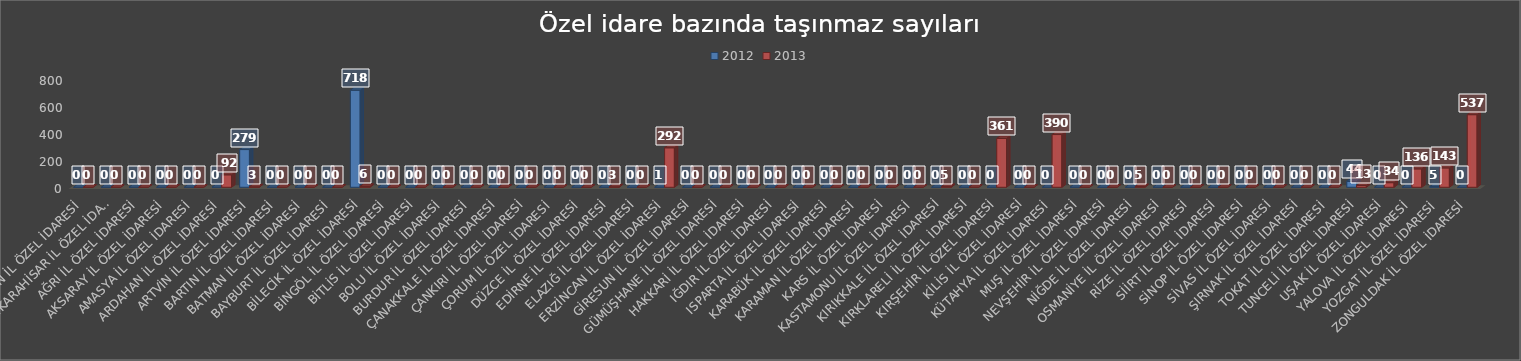
| Category | 2012 | 2013 |
|---|---|---|
| ADIYAMAN İL ÖZEL İDARESİ | 0 | 0 |
| AFYONKARAHİSAR İL ÖZEL İDARESİ | 0 | 0 |
| AĞRI İL ÖZEL İDARESİ | 0 | 0 |
| AKSARAY İL ÖZEL İDARESİ | 0 | 0 |
| AMASYA İL ÖZEL İDARESİ | 0 | 0 |
| ARDAHAN İL ÖZEL İDARESİ | 0 | 92 |
| ARTVİN İL ÖZEL İDARESİ | 279 | 3 |
| BARTIN İL ÖZEL İDARESİ | 0 | 0 |
| BATMAN İL ÖZEL İDARESİ | 0 | 0 |
| BAYBURT İL ÖZEL İDARESİ | 0 | 0 |
| BİLECİK İL ÖZEL İDARESİ | 718 | 6 |
| BİNGÖL İL ÖZEL İDARESİ | 0 | 0 |
| BİTLİS İL ÖZEL İDARESİ | 0 | 0 |
| BOLU İL ÖZEL İDARESİ | 0 | 0 |
| BURDUR İL ÖZEL İDARESİ | 0 | 0 |
| ÇANAKKALE İL ÖZEL İDARESİ | 0 | 0 |
| ÇANKIRI İL ÖZEL İDARESİ | 0 | 0 |
| ÇORUM İL ÖZEL İDARESİ | 0 | 0 |
| DÜZCE İL ÖZEL İDARESİ | 0 | 0 |
| EDİRNE İL ÖZEL İDARESİ | 0 | 3 |
| ELAZIĞ İL ÖZEL İDARESİ | 0 | 0 |
| ERZİNCAN İL ÖZEL İDARESİ | 1 | 292 |
| GİRESUN İL ÖZEL İDARESİ | 0 | 0 |
| GÜMÜŞHANE İL ÖZEL İDARESİ | 0 | 0 |
| HAKKARİ İL ÖZEL İDARESİ | 0 | 0 |
| IĞDIR İL ÖZEL İDARESİ | 0 | 0 |
| ISPARTA İL ÖZEL İDARESİ | 0 | 0 |
| KARABÜK İL ÖZEL İDARESİ | 0 | 0 |
| KARAMAN İL ÖZEL İDARESİ | 0 | 0 |
| KARS İL ÖZEL İDARESİ | 0 | 0 |
| KASTAMONU İL ÖZEL İDARESİ | 0 | 0 |
| KIRIKKALE İL ÖZEL İDARESİ | 0 | 5 |
| KIRKLARELİ İL ÖZEL İDARESİ | 0 | 0 |
| KIRŞEHİR İL ÖZEL İDARESİ | 0 | 361 |
| KİLİS İL ÖZEL İDARESİ | 0 | 0 |
| KÜTAHYA İL ÖZEL İDARESİ | 0 | 390 |
| MUŞ İL ÖZEL İDARESİ | 0 | 0 |
| NEVŞEHİR İL ÖZEL İDARESİ | 0 | 0 |
| NİĞDE İL ÖZEL İDARESİ | 0 | 5 |
| OSMANİYE İL ÖZEL İDARESİ | 0 | 0 |
| RİZE İL ÖZEL İDARESİ | 0 | 0 |
| SİİRT İL ÖZEL İDARESİ | 0 | 0 |
| SİNOP İL ÖZEL İDARESİ | 0 | 0 |
| SİVAS İL ÖZEL İDARESİ | 0 | 0 |
| ŞIRNAK İL ÖZEL İDARESİ | 0 | 0 |
| TOKAT İL ÖZEL İDARESİ | 0 | 0 |
| TUNCELİ İL ÖZEL İDARESİ | 44 | 13 |
| UŞAK İL ÖZEL İDARESİ | 0 | 34 |
| YALOVA İL ÖZEL İDARESİ | 0 | 136 |
| YOZGAT İL ÖZEL İDARESİ | 5 | 143 |
| ZONGULDAK İL ÖZEL İDARESİ | 0 | 537 |